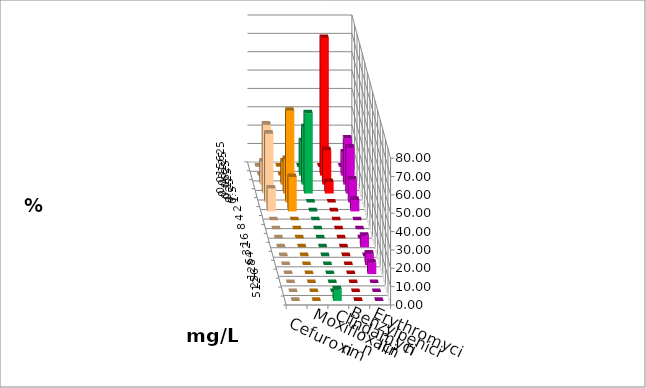
| Category | Cefuroxim | Moxifloxacin | Clindamycin | Benzylpenicillin | Erythromycin |
|---|---|---|---|---|---|
| 0.015625 | 0 | 0 | 0 | 0 | 0 |
| 0.03125 | 0 | 0 | 18.75 | 75 | 12.5 |
| 0.0625 | 12.5 | 12.5 | 31.25 | 18.75 | 25 |
| 0.125 | 37.5 | 18.75 | 43.75 | 6.25 | 25 |
| 0.25 | 37.5 | 50 | 0 | 0 | 12.5 |
| 0.5 | 12.5 | 18.75 | 0 | 0 | 6.25 |
| 1.0 | 0 | 0 | 0 | 0 | 0 |
| 2.0 | 0 | 0 | 0 | 0 | 0 |
| 4.0 | 0 | 0 | 0 | 0 | 0 |
| 8.0 | 0 | 0 | 0 | 0 | 6.25 |
| 16.0 | 0 | 0 | 0 | 0 | 0 |
| 32.0 | 0 | 0 | 0 | 0 | 6.25 |
| 64.0 | 0 | 0 | 0 | 0 | 6.25 |
| 128.0 | 0 | 0 | 0 | 0 | 0 |
| 256.0 | 0 | 0 | 0 | 0 | 0 |
| 512.0 | 0 | 0 | 6.25 | 0 | 0 |